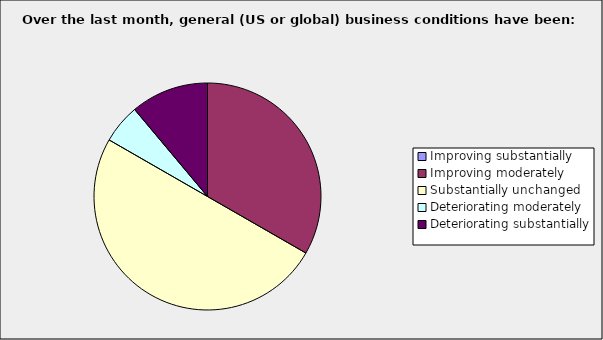
| Category | Series 0 |
|---|---|
| Improving substantially | 0 |
| Improving moderately | 0.333 |
| Substantially unchanged | 0.5 |
| Deteriorating moderately | 0.056 |
| Deteriorating substantially | 0.111 |